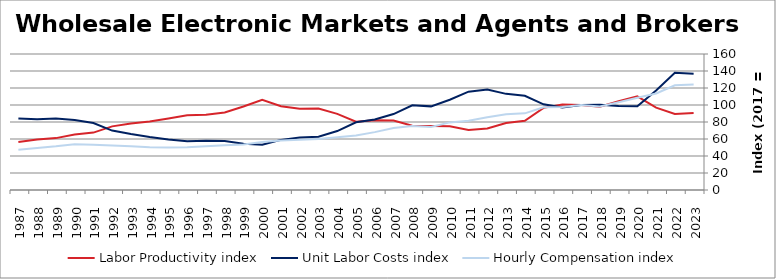
| Category | Labor Productivity index | Unit Labor Costs index | Hourly Compensation index |
|---|---|---|---|
| 2023.0 | 90.713 | 136.685 | 123.991 |
| 2022.0 | 89.373 | 137.871 | 123.219 |
| 2021.0 | 96.928 | 117.163 | 113.564 |
| 2020.0 | 110.138 | 98.555 | 108.547 |
| 2019.0 | 104.452 | 98.916 | 103.32 |
| 2018.0 | 98.033 | 100.313 | 98.341 |
| 2017.0 | 100 | 100 | 100 |
| 2016.0 | 100.707 | 97.084 | 97.77 |
| 2015.0 | 96.637 | 100.786 | 97.397 |
| 2014.0 | 81.385 | 110.778 | 90.157 |
| 2013.0 | 78.838 | 113.102 | 89.167 |
| 2012.0 | 72.383 | 118.286 | 85.619 |
| 2011.0 | 70.483 | 115.692 | 81.543 |
| 2010.0 | 74.888 | 106.216 | 79.543 |
| 2009.0 | 75.235 | 98.385 | 74.02 |
| 2008.0 | 75.665 | 99.672 | 75.417 |
| 2007.0 | 81.679 | 89.368 | 72.995 |
| 2006.0 | 82.166 | 82.855 | 68.079 |
| 2005.0 | 80.413 | 79.668 | 64.063 |
| 2004.0 | 89.584 | 69.335 | 62.113 |
| 2003.0 | 95.823 | 62.754 | 60.132 |
| 2002.0 | 95.583 | 61.804 | 59.074 |
| 2001.0 | 98.548 | 58.96 | 58.104 |
| 2000.0 | 106.197 | 53.184 | 56.48 |
| 1999.0 | 98.257 | 54.396 | 53.448 |
| 1998.0 | 91.119 | 57.674 | 52.551 |
| 1997.0 | 88.623 | 57.962 | 51.368 |
| 1996.0 | 87.983 | 57.279 | 50.396 |
| 1995.0 | 84.225 | 59.5 | 50.114 |
| 1994.0 | 80.577 | 62.272 | 50.177 |
| 1993.0 | 78.366 | 65.818 | 51.579 |
| 1992.0 | 74.851 | 69.923 | 52.338 |
| 1991.0 | 67.517 | 78.882 | 53.259 |
| 1990.0 | 65.409 | 82.401 | 53.898 |
| 1989.0 | 61.043 | 84.162 | 51.375 |
| 1988.0 | 59.489 | 83.115 | 49.444 |
| 1987.0 | 56.355 | 84.251 | 47.48 |